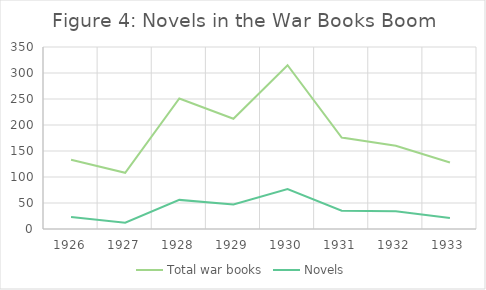
| Category | Total war books | Novels |
|---|---|---|
| 1926.0 | 133 | 23 |
| 1927.0 | 108 | 12 |
| 1928.0 | 251 | 56 |
| 1929.0 | 212 | 47 |
| 1930.0 | 315 | 77 |
| 1931.0 | 176 | 35 |
| 1932.0 | 160 | 34 |
| 1933.0 | 128 | 21 |